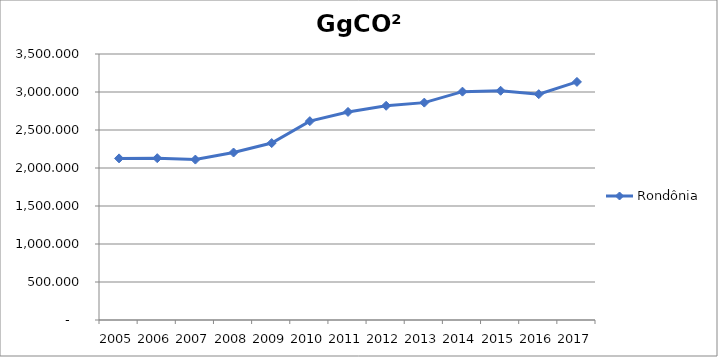
| Category | Rondônia |
|---|---|
| 2005.0 | 2126.58 |
| 2006.0 | 2129.155 |
| 2007.0 | 2110.796 |
| 2008.0 | 2203.564 |
| 2009.0 | 2327.925 |
| 2010.0 | 2616.4 |
| 2011.0 | 2737.804 |
| 2012.0 | 2818.489 |
| 2013.0 | 2860.265 |
| 2014.0 | 3004.747 |
| 2015.0 | 3016.341 |
| 2016.0 | 2971.24 |
| 2017.0 | 3132.685 |